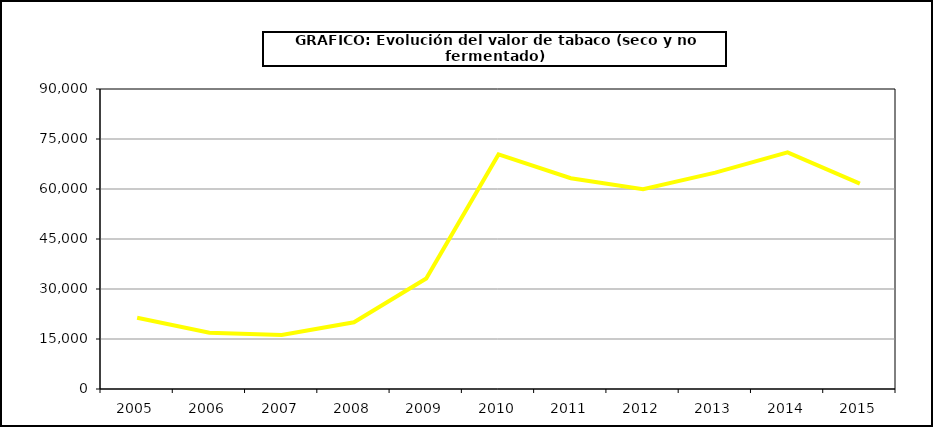
| Category | Valor |
|---|---|
| 2005.0 | 21397.432 |
| 2006.0 | 16864.378 |
| 2007.0 | 16185.843 |
| 2008.0 | 20011.548 |
| 2009.0 | 33141.373 |
| 2010.0 | 70384.847 |
| 2011.0 | 63219.669 |
| 2012.0 | 59963.648 |
| 2013.0 | 64900.043 |
| 2014.0 | 70983.122 |
| 2015.0 | 61634.5 |